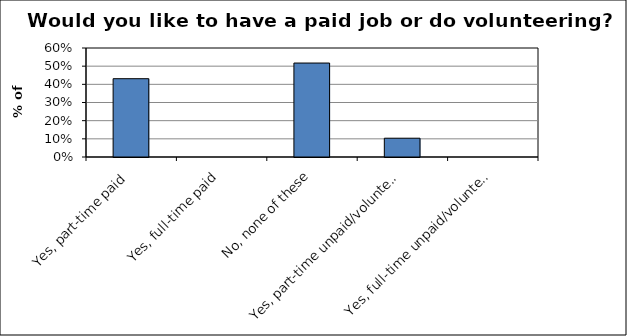
| Category | Series 0 |
|---|---|
| Yes, part-time paid | 0.431 |
| Yes, full-time paid | 0 |
| No, none of these | 0.517 |
| Yes, part-time unpaid/volunteer | 0.103 |
| Yes, full-time unpaid/volunteer | 0 |